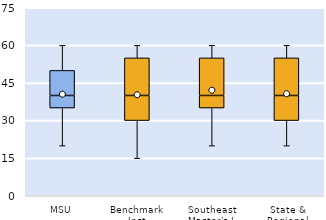
| Category | 25th | 50th | 75th |
|---|---|---|---|
| MSU | 35 | 5 | 10 |
| Benchmark Inst | 30 | 10 | 15 |
| Southeast Master's-L | 35 | 5 | 15 |
| State & Regional | 30 | 10 | 15 |